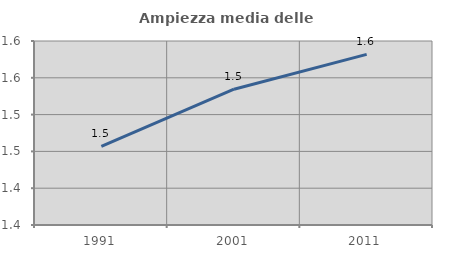
| Category | Ampiezza media delle famiglie |
|---|---|
| 1991.0 | 1.457 |
| 2001.0 | 1.534 |
| 2011.0 | 1.582 |